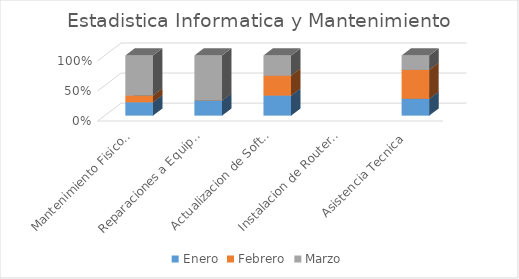
| Category | Enero | Febrero | Marzo |
|---|---|---|---|
| Mantenimiento Fisico y Logico | 4 | 2 | 12 |
| Reparaciones a Equipos  | 1 | 0 | 3 |
| Actualizacion de Software | 5 | 5 | 5 |
| Instalacion de Router Inalambrico | 0 | 0 | 0 |
| Asistencia Tecnica | 7 | 12 | 6 |